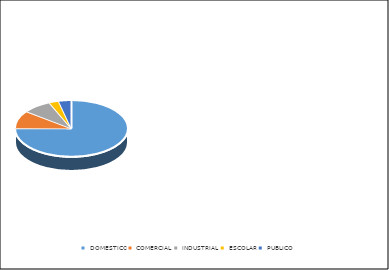
| Category | Series 0 |
|---|---|
| DOMESTICO | 689854.609 |
| COMERCIAL | 93140.191 |
| INDUSTRIAL | 75668.731 |
| ESCOLAR | 25624.069 |
| PUBLICO | 33635.804 |